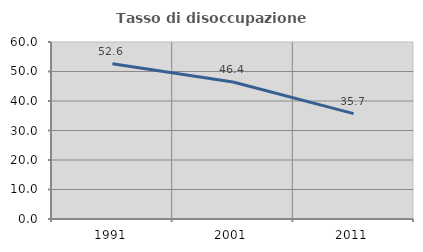
| Category | Tasso di disoccupazione giovanile  |
|---|---|
| 1991.0 | 52.632 |
| 2001.0 | 46.429 |
| 2011.0 | 35.714 |